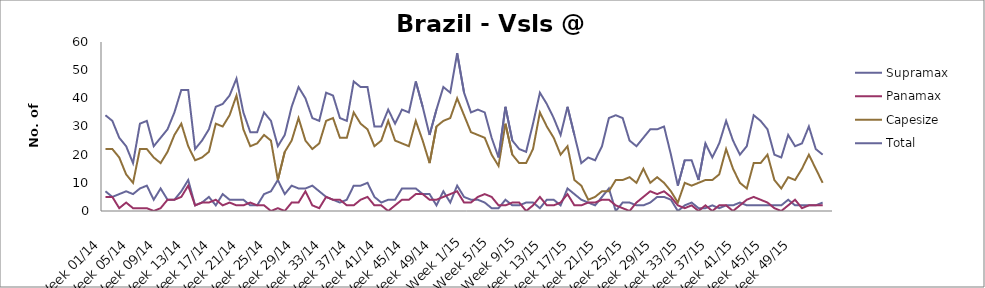
| Category | Supramax | Panamax | Capesize | Total |
|---|---|---|---|---|
| Week 01/14 | 7 | 5 | 22 | 34 |
| Week 02/14 | 5 | 5 | 22 | 32 |
| Week 03/14 | 6 | 1 | 19 | 26 |
| Week 04/14 | 7 | 3 | 13 | 23 |
| Week 05/14 | 6 | 1 | 10 | 17 |
| Week 06/14 | 8 | 1 | 22 | 31 |
| Week 07/14 | 9 | 1 | 22 | 32 |
| Week 08/14 | 4 | 0 | 19 | 23 |
| Week 09/14 | 8 | 1 | 17 | 26 |
| Week 10/14 | 4 | 4 | 21 | 29 |
| Week 11/14 | 4 | 4 | 27 | 35 |
| Week 12/14 | 7 | 5 | 31 | 43 |
| Week 13/14 | 11 | 9 | 23 | 43 |
| Week 14/14 | 2 | 2 | 18 | 22 |
| Week 15/14 | 3 | 3 | 19 | 25 |
| Week 16/14 | 5 | 3 | 21 | 29 |
| Week 17/14 | 2 | 4 | 31 | 37 |
| Week 18/14 | 6 | 2 | 30 | 38 |
| Week 19/14 | 4 | 3 | 34 | 41 |
| Week 20/14 | 4 | 2 | 41 | 47 |
| Week 21/14 | 4 | 2 | 29 | 35 |
| Week 22/14 | 2 | 3 | 23 | 28 |
| Week 23/14 | 2 | 2 | 24 | 28 |
| Week 24/14 | 6 | 2 | 27 | 35 |
| Week 25/14 | 7 | 0 | 25 | 32 |
| Week 26/14 | 11 | 1 | 11 | 23 |
| Week 27/14 | 6 | 0 | 21 | 27 |
| Week 28/14 | 9 | 3 | 25 | 37 |
| Week 29/14 | 8 | 3 | 33 | 44 |
| Week 30/14 | 8 | 7 | 25 | 40 |
| Week 31/14 | 9 | 2 | 22 | 33 |
| Week 32/14 | 7 | 1 | 24 | 32 |
| Week 33/14 | 5 | 5 | 32 | 42 |
| Week 34/14 | 4 | 4 | 33 | 41 |
| Week 35/14 | 3 | 4 | 26 | 33 |
| Week 36/14 | 4 | 2 | 26 | 32 |
| Week 37/14 | 9 | 2 | 35 | 46 |
| Week 38/14 | 9 | 4 | 31 | 44 |
| Week 39/14 | 10 | 5 | 29 | 44 |
| Week 40/14 | 5 | 2 | 23 | 30 |
| Week 41/14 | 3 | 2 | 25 | 30 |
| Week 42/14 | 4 | 0 | 32 | 36 |
| Week 43/14 | 4 | 2 | 25 | 31 |
| Week 44/14 | 8 | 4 | 24 | 36 |
| Week 45/14 | 8 | 4 | 23 | 35 |
| Week 46/14 | 8 | 6 | 32 | 46 |
| Week 47/14 | 6 | 6 | 25 | 37 |
| Week 48/14 | 6 | 4 | 17 | 27 |
| Week 49/14 | 2 | 4 | 30 | 36 |
| Week 50/14 | 7 | 5 | 32 | 44 |
| Week 51/14 | 3 | 6 | 33 | 42 |
| Week 52/14 | 9 | 7 | 40 | 56 |
| Week 1/15 | 5 | 3 | 34 | 42 |
| Week 2/15 | 4 | 3 | 28 | 35 |
| Week 3/15 | 4 | 5 | 27 | 36 |
| Week 4/15 | 3 | 6 | 26 | 35 |
| Week 5/15 | 1 | 5 | 20 | 26 |
| Week 6/15 | 1 | 2 | 16 | 19 |
| Week 7/15 | 4 | 2 | 31 | 37 |
| Week 8/15 | 2 | 3 | 20 | 25 |
| Week 9/15 | 2 | 3 | 17 | 22 |
| Week 10/15 | 3 | 0 | 17 | 21 |
| Week 11/15 | 3 | 2 | 22 | 31 |
| Week 12/15 | 1 | 5 | 35 | 42 |
| Week 13/15 | 4 | 2 | 30 | 38 |
| Week 14/15 | 4 | 2 | 26 | 33 |
| Week 15/15 | 2 | 3 | 20 | 27 |
| Week 16/15 | 8 | 6 | 23 | 37 |
| Week 17/15 | 6 | 2 | 11 | 27 |
| Week 18/15 | 4 | 2 | 9 | 17 |
| Week 19/15 | 3 | 3 | 4 | 19 |
| Week 20/15 | 2 | 3 | 5 | 18 |
| Week 21/15 | 5 | 4 | 7 | 23 |
| Week 22/15 | 8 | 4 | 7 | 33 |
| Week 23/15 | 0 | 2 | 11 | 34 |
| Week 24/15 | 3 | 1 | 11 | 33 |
| Week 25/15 | 3 | 0 | 12 | 25 |
| Week 26/15 | 2 | 3 | 10 | 23 |
| Week 27/15 | 2 | 5 | 15 | 26 |
| Week 28/15 | 3 | 7 | 10 | 29 |
| Week 29/15 | 5 | 6 | 12 | 29 |
| Week 30/15 | 5 | 7 | 10 | 30 |
| Week 31/15 | 4 | 5 | 7 | 20 |
| Week 32/15 | 0 | 2 | 3 | 9 |
| Week 33/15 | 2 | 1 | 10 | 18 |
| Week 34/15 | 3 | 2 | 9 | 18 |
| Week 35/15 | 1 | 0 | 10 | 11 |
| Week 36/15 | 1 | 2 | 11 | 24 |
| Week 37/15 | 2 | 0 | 11 | 19 |
| Week 38/15 | 1 | 2 | 13 | 24 |
| Week 39/15 | 2 | 2 | 22 | 32 |
| Week 40/15 | 2 | 0 | 15 | 25 |
| Week 41/15 | 3 | 2 | 10 | 20 |
| Week 42/15 | 2 | 4 | 8 | 23 |
| Week 43/15 | 2 | 5 | 17 | 34 |
| Week 44/15 | 2 | 4 | 17 | 32 |
| Week 45/15 | 2 | 3 | 20 | 29 |
| Week 46/15 | 2 | 1 | 11 | 20 |
| Week 47/15 | 2 | 0 | 8 | 19 |
| Week 48/15 | 4 | 2 | 12 | 27 |
| Week 49/15 | 2 | 4 | 11 | 23 |
| Week 50/15 | 2 | 1 | 15 | 24 |